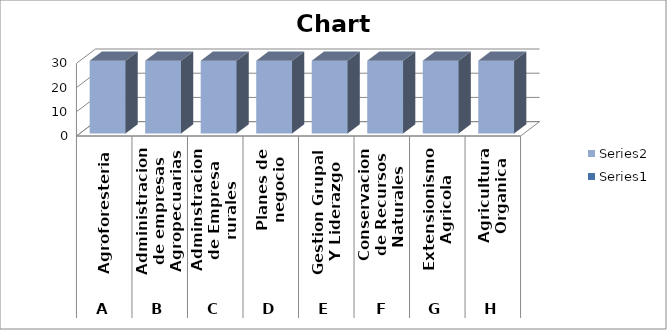
| Category | Series 0 | Series 1 |
|---|---|---|
| 0 |  | 30 |
| 1 |  | 30 |
| 2 |  | 30 |
| 3 |  | 30 |
| 4 |  | 30 |
| 5 |  | 30 |
| 6 |  | 30 |
| 7 |  | 30 |